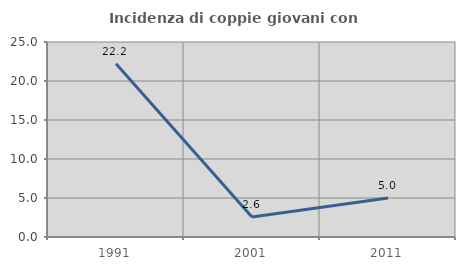
| Category | Incidenza di coppie giovani con figli |
|---|---|
| 1991.0 | 22.222 |
| 2001.0 | 2.564 |
| 2011.0 | 5 |